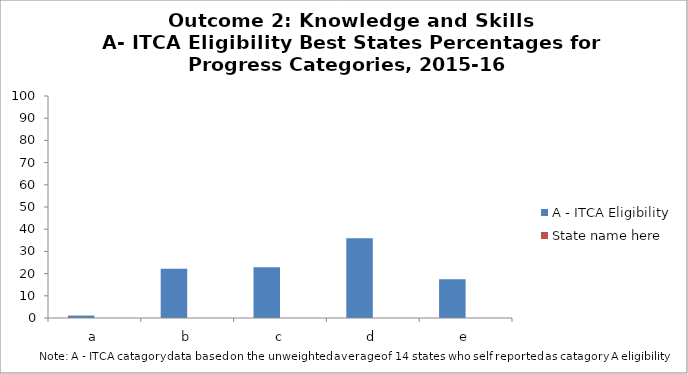
| Category | A - ITCA Eligibility | State name here |
|---|---|---|
| a | 1.1 |  |
| b | 22.2 |  |
| c | 22.9 |  |
| d | 35.9 |  |
| e | 17.4 |  |